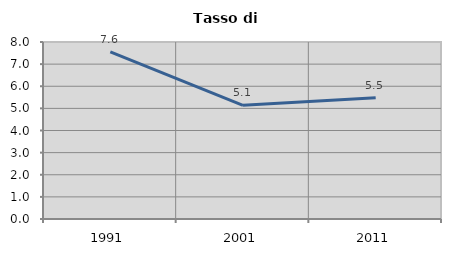
| Category | Tasso di disoccupazione   |
|---|---|
| 1991.0 | 7.55 |
| 2001.0 | 5.138 |
| 2011.0 | 5.482 |